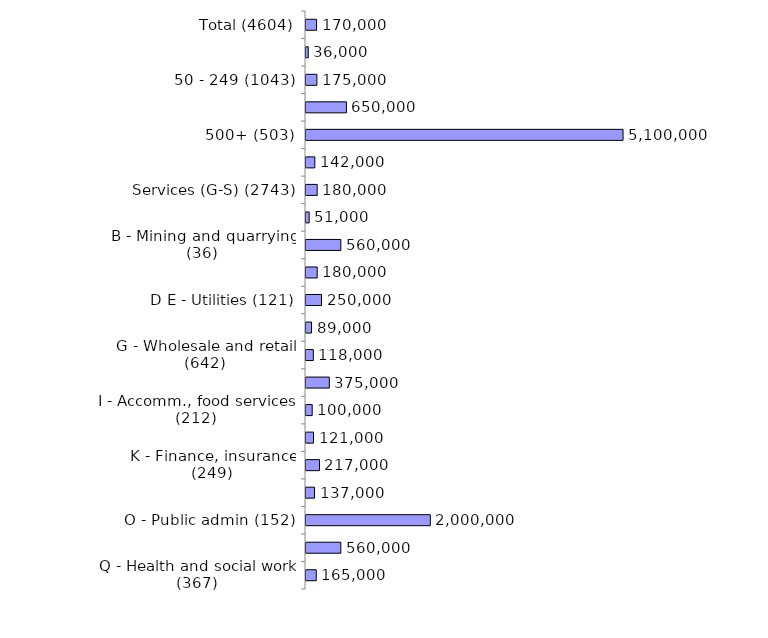
| Category | Series 0 |
|---|---|
| Total (4604) | 170000 |
| 10 - 49 (2678) | 36000 |
| 50 - 249 (1043) | 175000 |
| 250 - 499 (380) | 650000 |
| 500+ (503) | 5100000 |
| Production (A-F) (1861) | 142000 |
| Services (G-S) (2743) | 180000 |
| A - Agriculture (135) | 51000 |
| B - Mining and quarrying (36) | 560000 |
| C - Manufacturing (1396) | 180000 |
| D E - Utilities (121) | 250000 |
| F - Construction (173) | 89000 |
| G - Wholesale and retail (642) | 118000 |
| H - Transport , storage (203) | 375000 |
| I - Accomm., food services (212) | 100000 |
| J - Information, comms (170) | 121000 |
| K - Finance, insurance (249) | 217000 |
| LMNRS - Bus/tech/admin/arts/other (366) | 137000 |
| O - Public admin (152) | 2000000 |
| P - Education (382) | 560000 |
| Q - Health and social work (367) | 165000 |